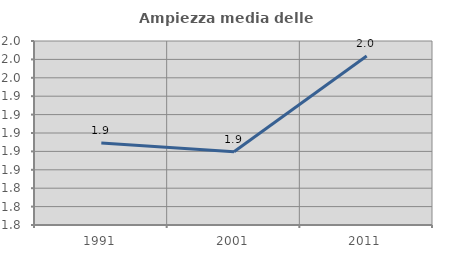
| Category | Ampiezza media delle famiglie |
|---|---|
| 1991.0 | 1.889 |
| 2001.0 | 1.88 |
| 2011.0 | 1.984 |